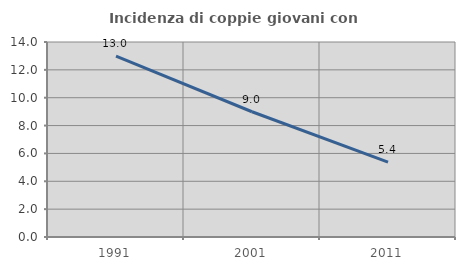
| Category | Incidenza di coppie giovani con figli |
|---|---|
| 1991.0 | 12.993 |
| 2001.0 | 8.992 |
| 2011.0 | 5.378 |